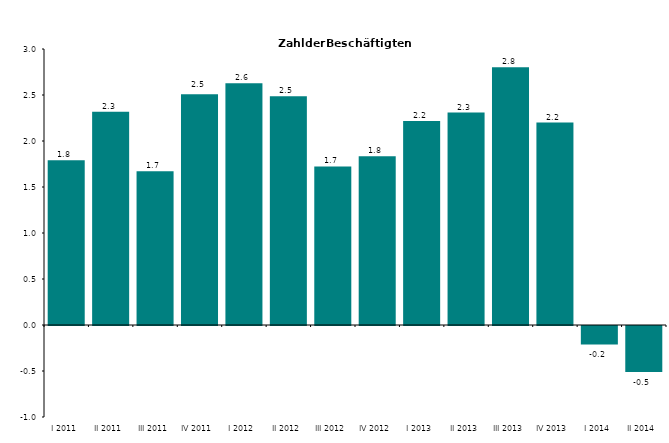
| Category | Series 0 |
|---|---|
| I 2011 | 1.79 |
| II 2011 | 2.319 |
| III 2011 | 1.672 |
| IV 2011 | 2.509 |
| I 2012 | 2.627 |
| II 2012 | 2.487 |
| III 2012 | 1.724 |
| IV 2012 | 1.834 |
| I 2013 | 2.218 |
| II 2013 | 2.309 |
| III 2013 | 2.802 |
| IV 2013 | 2.2 |
| I 2014 | -0.2 |
| II 2014 | -0.5 |